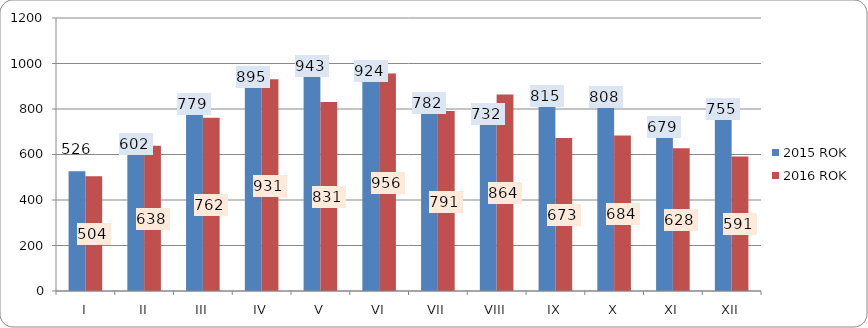
| Category | 2015 ROK | 2016 ROK |
|---|---|---|
| I | 526 | 504 |
| II | 602 | 638 |
| III | 779 | 762 |
| IV | 895 | 931 |
| V | 943 | 831 |
| VI | 924 | 956 |
| VII | 782 | 791 |
| VIII | 732 | 864 |
| IX | 815 | 673 |
| X | 808 | 684 |
| XI | 679 | 628 |
| XII | 755 | 591 |